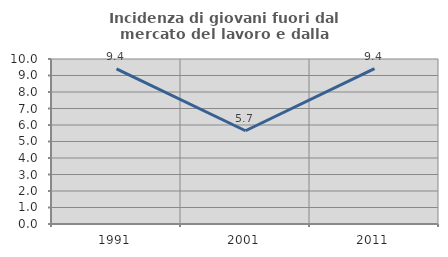
| Category | Incidenza di giovani fuori dal mercato del lavoro e dalla formazione  |
|---|---|
| 1991.0 | 9.405 |
| 2001.0 | 5.652 |
| 2011.0 | 9.412 |